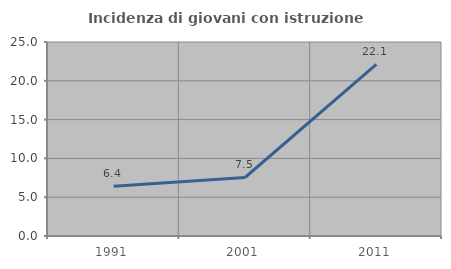
| Category | Incidenza di giovani con istruzione universitaria |
|---|---|
| 1991.0 | 6.417 |
| 2001.0 | 7.54 |
| 2011.0 | 22.12 |